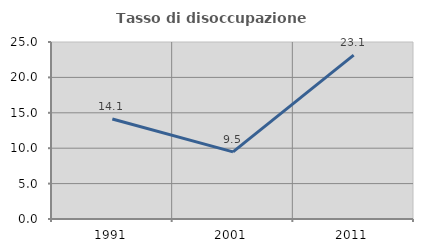
| Category | Tasso di disoccupazione giovanile  |
|---|---|
| 1991.0 | 14.132 |
| 2001.0 | 9.48 |
| 2011.0 | 23.148 |